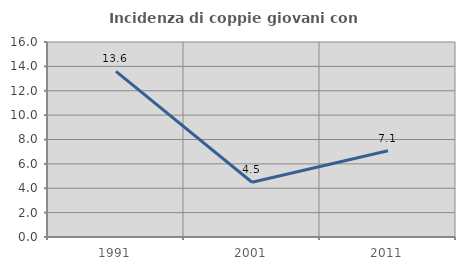
| Category | Incidenza di coppie giovani con figli |
|---|---|
| 1991.0 | 13.592 |
| 2001.0 | 4.494 |
| 2011.0 | 7.071 |